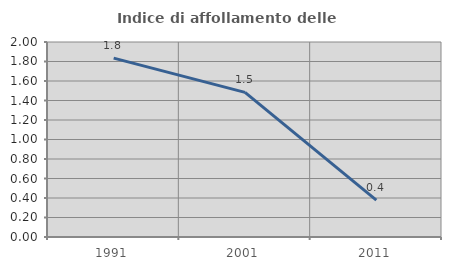
| Category | Indice di affollamento delle abitazioni  |
|---|---|
| 1991.0 | 1.835 |
| 2001.0 | 1.484 |
| 2011.0 | 0.378 |